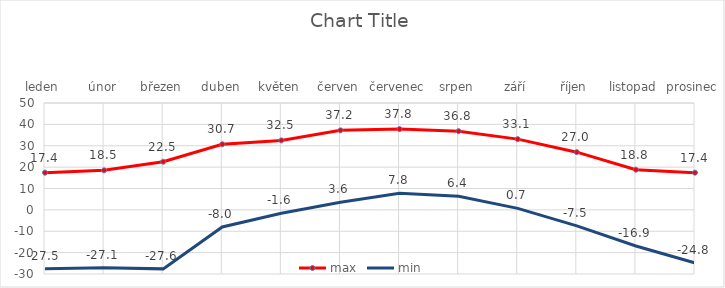
| Category | max | min |
|---|---|---|
| leden | 17.4 | -27.5 |
| únor | 18.5 | -27.1 |
| březen | 22.5 | -27.6 |
| duben | 30.7 | -8 |
| květen | 32.5 | -1.6 |
| červen | 37.2 | 3.6 |
| červenec | 37.8 | 7.8 |
| srpen | 36.8 | 6.4 |
| září | 33.1 | 0.7 |
| říjen | 27 | -7.5 |
| listopad | 18.8 | -16.9 |
| prosinec | 17.4 | -24.8 |